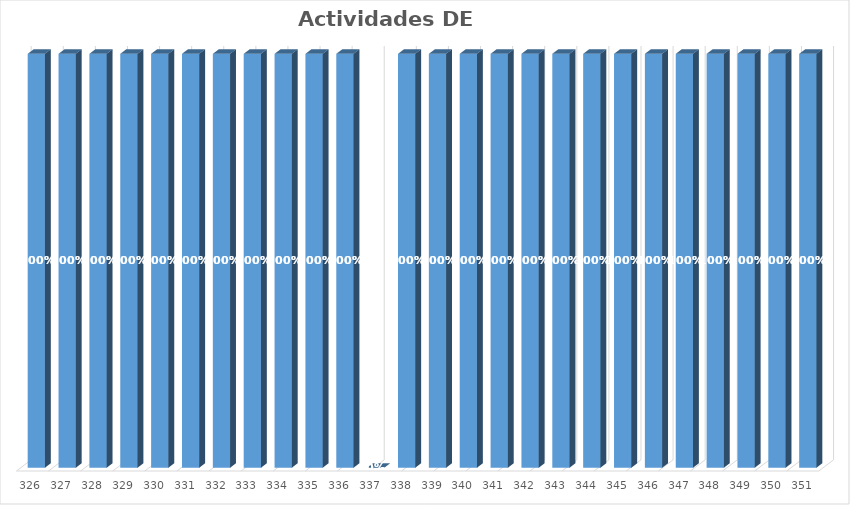
| Category | % Avance |
|---|---|
| 326.0 | 1 |
| 327.0 | 1 |
| 328.0 | 1 |
| 329.0 | 1 |
| 330.0 | 1 |
| 331.0 | 1 |
| 332.0 | 1 |
| 333.0 | 1 |
| 334.0 | 1 |
| 335.0 | 1 |
| 336.0 | 1 |
| 337.0 | 0 |
| 338.0 | 1 |
| 339.0 | 1 |
| 340.0 | 1 |
| 341.0 | 1 |
| 342.0 | 1 |
| 343.0 | 1 |
| 344.0 | 1 |
| 345.0 | 1 |
| 346.0 | 1 |
| 347.0 | 1 |
| 348.0 | 1 |
| 349.0 | 1 |
| 350.0 | 1 |
| 351.0 | 1 |